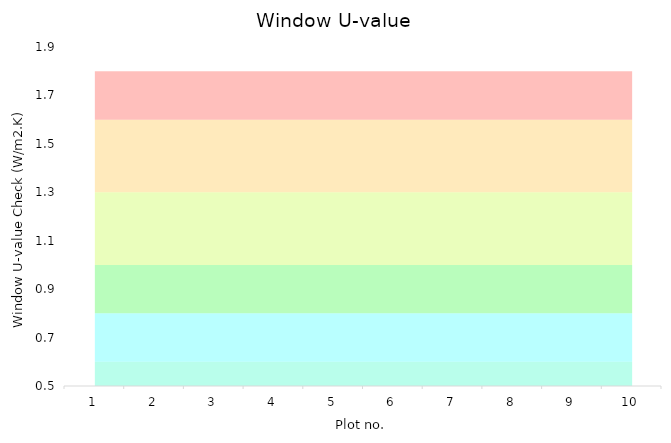
| Category | Series 1 | Series 2 | Series 3 | Series 4 | Series 5 | Series 0 |
|---|---|---|---|---|---|---|
| 0 | 0.6 | 0.2 | 0.2 | 0.3 | 0.3 | 0.2 |
| 1 | 0.6 | 0.2 | 0.2 | 0.3 | 0.3 | 0.2 |
| 2 | 0.6 | 0.2 | 0.2 | 0.3 | 0.3 | 0.2 |
| 3 | 0.6 | 0.2 | 0.2 | 0.3 | 0.3 | 0.2 |
| 4 | 0.6 | 0.2 | 0.2 | 0.3 | 0.3 | 0.2 |
| 5 | 0.6 | 0.2 | 0.2 | 0.3 | 0.3 | 0.2 |
| 6 | 0.6 | 0.2 | 0.2 | 0.3 | 0.3 | 0.2 |
| 7 | 0.6 | 0.2 | 0.2 | 0.3 | 0.3 | 0.2 |
| 8 | 0.6 | 0.2 | 0.2 | 0.3 | 0.3 | 0.2 |
| 9 | 0.6 | 0.2 | 0.2 | 0.3 | 0.3 | 0.2 |